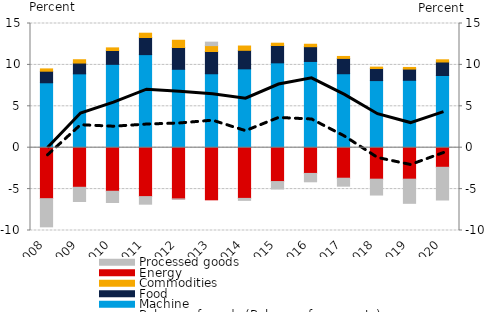
| Category | Machine | Food | Commodities | Energy | Processed goods |
|---|---|---|---|---|---|
| 2008.0 | 7.841 | 1.399 | 0.277 | -6.156 | -3.403 |
| 2009.0 | 8.919 | 1.305 | 0.4 | -4.781 | -1.72 |
| 2010.0 | 10.066 | 1.672 | 0.317 | -5.259 | -1.363 |
| 2011.0 | 11.241 | 2.07 | 0.517 | -5.906 | -0.916 |
| 2012.0 | 9.469 | 2.636 | 0.87 | -6.184 | -0.043 |
| 2013.0 | 8.929 | 2.689 | 0.711 | -6.295 | 0.421 |
| 2014.0 | 9.523 | 2.239 | 0.518 | -6.123 | -0.24 |
| 2015.0 | 10.249 | 2.091 | 0.28 | -4.088 | -0.905 |
| 2016.0 | 10.416 | 1.783 | 0.295 | -3.107 | -1.01 |
| 2017.0 | 8.933 | 1.852 | 0.236 | -3.686 | -0.96 |
| 2018.0 | 8.105 | 1.455 | 0.173 | -3.802 | -1.916 |
| 2019.0 | 8.142 | 1.353 | 0.197 | -3.801 | -2.917 |
| 2020.0 | 8.718 | 1.632 | 0.265 | -2.366 | -3.953 |